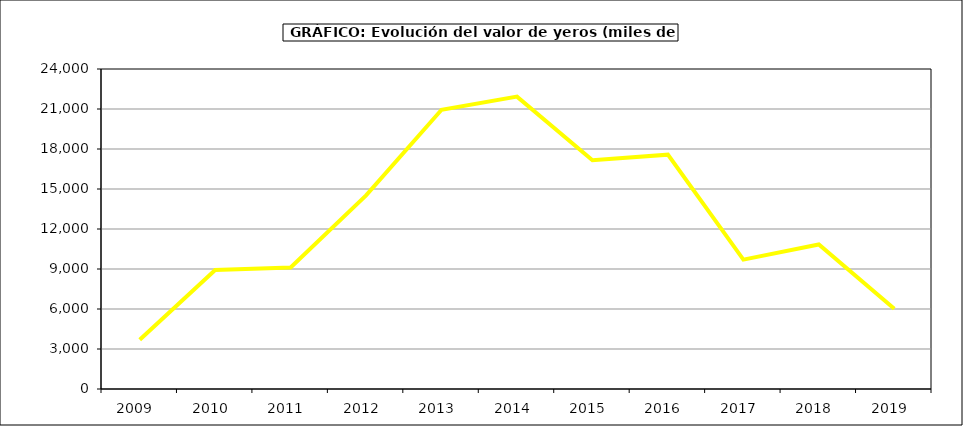
| Category | Valor |
|---|---|
| 2009.0 | 3689.373 |
| 2010.0 | 8923.742 |
| 2011.0 | 9108.203 |
| 2012.0 | 14519.486 |
| 2013.0 | 20944.865 |
| 2014.0 | 21928.601 |
| 2015.0 | 17159 |
| 2016.0 | 17573 |
| 2017.0 | 9700.839 |
| 2018.0 | 10839.154 |
| 2019.0 | 6015.545 |